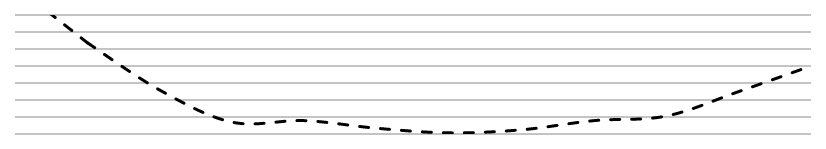
| Category | Torque Nm |
|---|---|
| 500.0 | 200 |
| 1000.0 | 303.588 |
| 1500.0 | 389.93 |
| 2000.0 | 448.419 |
| 2500.0 | 445.634 |
| 3000.0 | 459.56 |
| 3500.0 | 467.916 |
| 4000.0 | 462.345 |
| 4500.0 | 445.634 |
| 5000.0 | 437.278 |
| 5500.0 | 392.715 |
| 6000.0 | 346 |